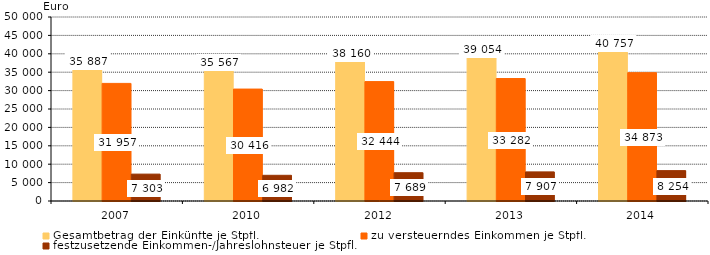
| Category | Gesamtbetrag der Einkünfte je Stpfl. | zu versteuerndes Einkommen je Stpfl. | festzusetzende Einkommen-/Jahreslohnsteuer je Stpfl. |
|---|---|---|---|
| 2007.0 | 35887 | 31957 | 7303 |
| 2010.0 | 35567 | 30416 | 6982 |
| 2012.0 | 38160 | 32444 | 7689 |
| 2013.0 | 39054 | 33282 | 7907 |
| 2014.0 | 40757 | 34873 | 8254 |